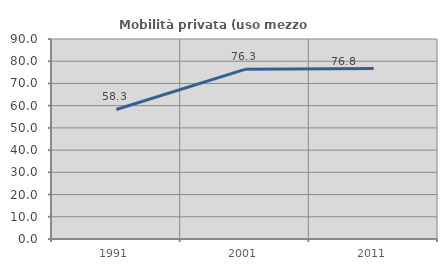
| Category | Mobilità privata (uso mezzo privato) |
|---|---|
| 1991.0 | 58.286 |
| 2001.0 | 76.344 |
| 2011.0 | 76.757 |